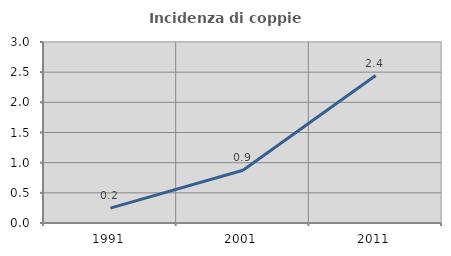
| Category | Incidenza di coppie miste |
|---|---|
| 1991.0 | 0.246 |
| 2001.0 | 0.875 |
| 2011.0 | 2.444 |